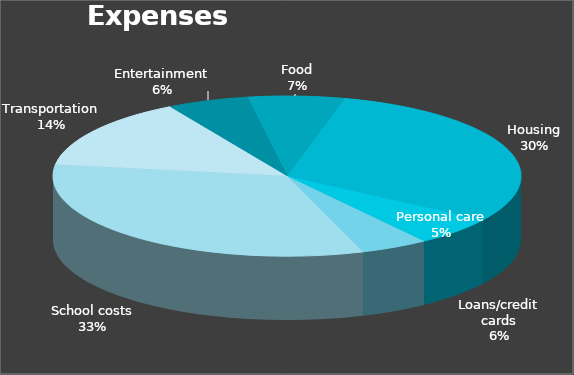
| Category | Total |
|---|---|
| Entertainment | 168 |
| Food | 200 |
| Housing | 906 |
| Loans/credit cards | 175 |
| Personal care | 140 |
| School costs | 975 |
| Transportation | 430 |